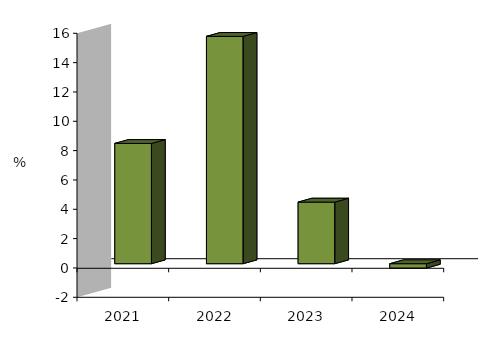
| Category | I.C.I |
|---|---|
| 2021-02-01 | 8.2 |
| 2022-02-01 | 15.5 |
| 2023-02-01 | 4.2 |
| 2024-02-01 | -0.3 |